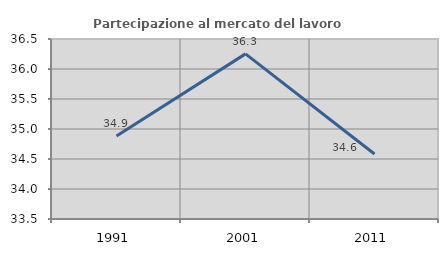
| Category | Partecipazione al mercato del lavoro  femminile |
|---|---|
| 1991.0 | 34.884 |
| 2001.0 | 36.252 |
| 2011.0 | 34.583 |